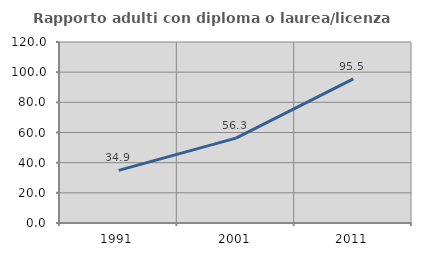
| Category | Rapporto adulti con diploma o laurea/licenza media  |
|---|---|
| 1991.0 | 34.884 |
| 2001.0 | 56.306 |
| 2011.0 | 95.51 |